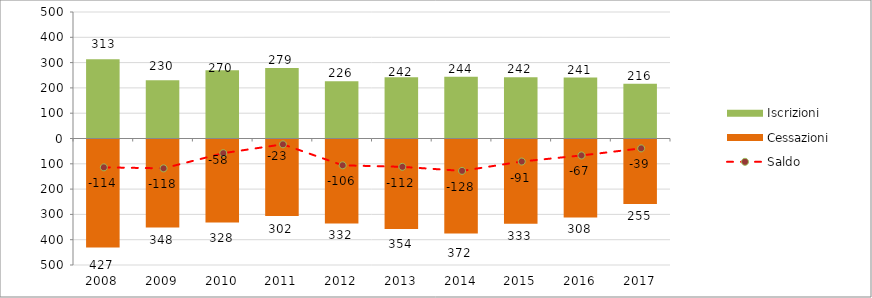
| Category | Iscrizioni | Cessazioni |
|---|---|---|
| 2008.0 | 313 | -427 |
| 2009.0 | 230 | -348 |
| 2010.0 | 270 | -328 |
| 2011.0 | 279 | -302 |
| 2012.0 | 226 | -332 |
| 2013.0 | 242 | -354 |
| 2014.0 | 244 | -372 |
| 2015.0 | 242 | -333 |
| 2016.0 | 241 | -308 |
| 2017.0 | 216 | -255 |